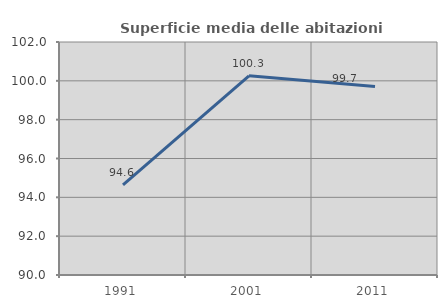
| Category | Superficie media delle abitazioni occupate |
|---|---|
| 1991.0 | 94.638 |
| 2001.0 | 100.26 |
| 2011.0 | 99.71 |